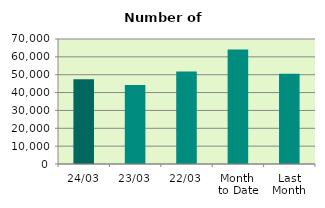
| Category | Series 0 |
|---|---|
| 24/03 | 47490 |
| 23/03 | 44218 |
| 22/03 | 51830 |
| Month 
to Date | 64089.333 |
| Last
Month | 50484.7 |